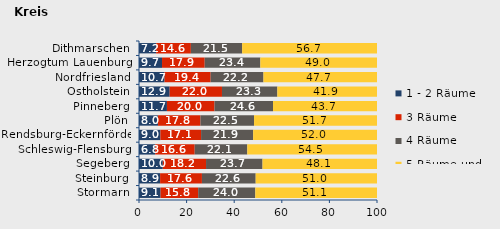
| Category | 1 - 2 Räume | 3 Räume | 4 Räume | 5 Räume und mehr |
|---|---|---|---|---|
| Stormarn | 9.061 | 15.808 | 23.996 | 51.135 |
| Steinburg | 8.868 | 17.577 | 22.581 | 50.974 |
| Segeberg | 9.999 | 18.167 | 23.734 | 48.1 |
| Schleswig-Flensburg | 6.813 | 16.597 | 22.094 | 54.496 |
| Rendsburg-Eckernförde | 8.998 | 17.087 | 21.883 | 52.032 |
| Plön | 7.993 | 17.832 | 22.521 | 51.655 |
| Pinneberg | 11.735 | 19.985 | 24.595 | 43.684 |
| Ostholstein | 12.885 | 21.98 | 23.266 | 41.869 |
| Nordfriesland | 10.74 | 19.37 | 22.186 | 47.704 |
| Herzogtum Lauenburg | 9.673 | 17.938 | 23.374 | 49.015 |
| Dithmarschen | 7.216 | 14.584 | 21.54 | 56.66 |